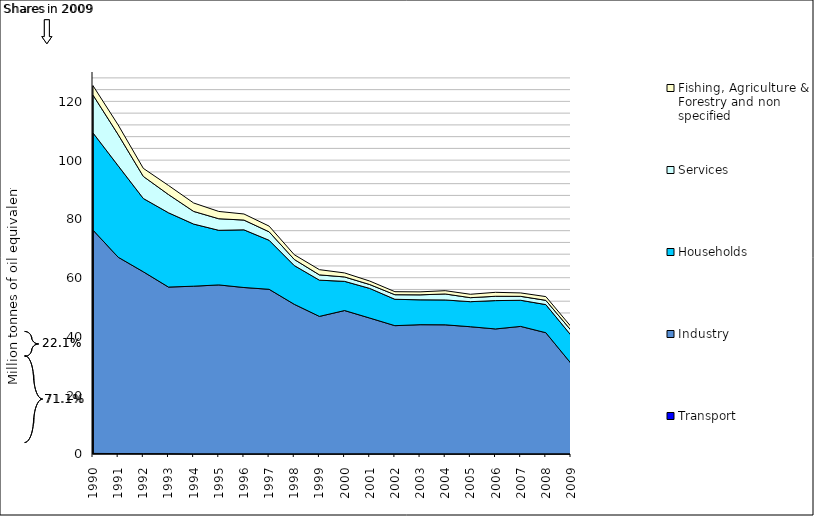
| Category | Transport | Industry | Households | Services | Fishing, Agriculture & Forestry and non specified |
|---|---|---|---|---|---|
| 1990.0 | 0.207 | 75.982 | 33.089 | 12.883 | 3.177 |
| 1991.0 | 0.152 | 66.817 | 31.117 | 10.615 | 3.281 |
| 1992.0 | 0.118 | 61.896 | 24.944 | 7.515 | 2.737 |
| 1993.0 | 0.097 | 56.709 | 25.285 | 6.206 | 3.098 |
| 1994.0 | 0.018 | 57.088 | 21.143 | 4.312 | 2.859 |
| 1995.0 | 0.017 | 57.528 | 18.584 | 3.935 | 2.482 |
| 1996.0 | 0.014 | 56.645 | 19.627 | 3.321 | 2.072 |
| 1997.0 | 0.014 | 56.041 | 16.679 | 2.881 | 1.936 |
| 1998.0 | 0.007 | 50.942 | 13.193 | 2.075 | 1.611 |
| 1999.0 | 0.004 | 46.823 | 12.332 | 1.802 | 1.77 |
| 2000.0 | 0.01 | 48.812 | 9.934 | 1.496 | 1.369 |
| 2001.0 | 0.032 | 46.239 | 10.078 | 1.321 | 1.185 |
| 2002.0 | 0.03 | 43.643 | 8.979 | 1.557 | 1.03 |
| 2003.0 | 0.006 | 43.999 | 8.462 | 1.696 | 1.014 |
| 2004.0 | 0.006 | 43.954 | 8.464 | 2.039 | 1.115 |
| 2005.0 | 0.008 | 43.305 | 8.525 | 1.36 | 1.16 |
| 2006.0 | 0.003 | 42.557 | 9.646 | 1.473 | 1.342 |
| 2007.0 | 0.003 | 43.423 | 8.889 | 1.342 | 1.16 |
| 2008.0 | 0.005 | 41.271 | 9.567 | 1.449 | 1.272 |
| 2009.0 | 0.006 | 30.832 | 9.575 | 1.701 | 1.252 |